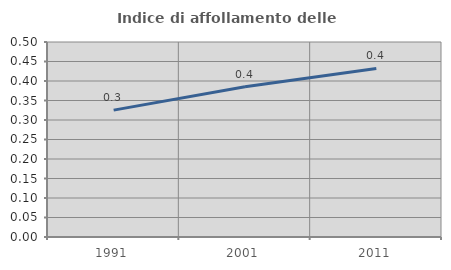
| Category | Indice di affollamento delle abitazioni  |
|---|---|
| 1991.0 | 0.325 |
| 2001.0 | 0.385 |
| 2011.0 | 0.432 |